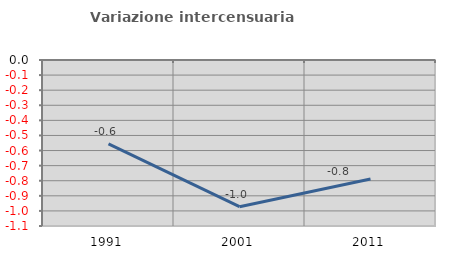
| Category | Variazione intercensuaria annua |
|---|---|
| 1991.0 | -0.555 |
| 2001.0 | -0.972 |
| 2011.0 | -0.788 |